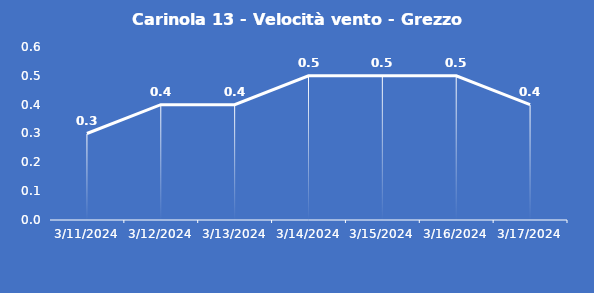
| Category | Carinola 13 - Velocità vento - Grezzo (m/s) |
|---|---|
| 3/11/24 | 0.3 |
| 3/12/24 | 0.4 |
| 3/13/24 | 0.4 |
| 3/14/24 | 0.5 |
| 3/15/24 | 0.5 |
| 3/16/24 | 0.5 |
| 3/17/24 | 0.4 |